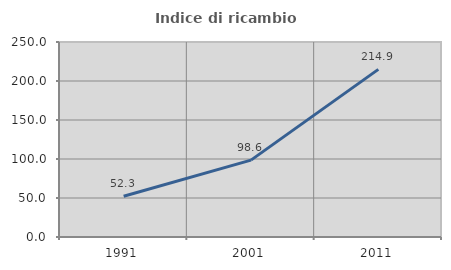
| Category | Indice di ricambio occupazionale  |
|---|---|
| 1991.0 | 52.273 |
| 2001.0 | 98.592 |
| 2011.0 | 214.894 |